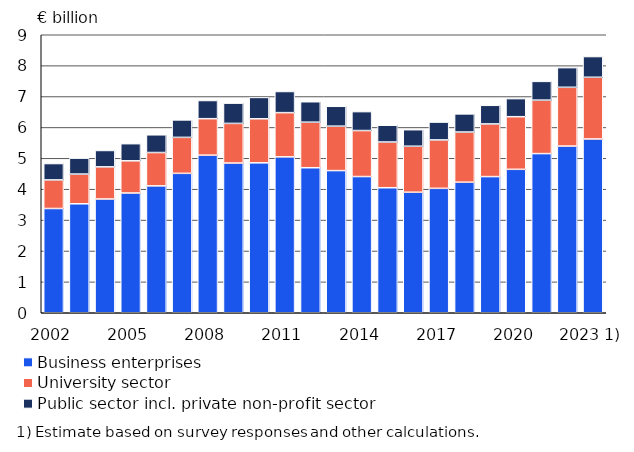
| Category | Business enterprises | University sector | Public sector incl. private non-profit sector |
|---|---|---|---|
| 2002 | 3375.1 | 925.6 | 529.7 |
| 2003 | 3527.9 | 961.7 | 515.4 |
| 2004 | 3683.5 | 1039.9 | 530.1 |
| 2005 | 3876.9 | 1042.2 | 554.7 |
| 2006 | 4107.8 | 1079.2 | 574.2 |
| 2007 | 4513.4 | 1164.6 | 564.7 |
| 2008 | 5102 | 1180.6 | 588.5 |
| 2009 | 4847.2 | 1282.8 | 656.5 |
| 2010 | 4854 | 1424.8 | 692 |
| 2011 | 5047 | 1431.8 | 684.4 |
| 2012 | 4695 | 1474.6 | 662.2 |
| 2013 | 4602.4 | 1438.1 | 643.6 |
| 2014 | 4409.5 | 1489.5 | 613.1 |
| 2015 | 4047.3 | 1480.5 | 543.1 |
| 2016 | 3901.7 | 1489.8 | 534.6 |
| 2017 | 4028.4 | 1567.2 | 577.7 |
| 2018 | 4227 | 1624 | 587 |
| 2019 | 4408 | 1705 | 603 |
| 2020 | 4644 | 1703 | 586 |
| 2021 | 5153 | 1731 | 607 |
| 2022 | 5397 | 1902 | 637 |
| 2023 1) | 5627 | 1997 | 670 |